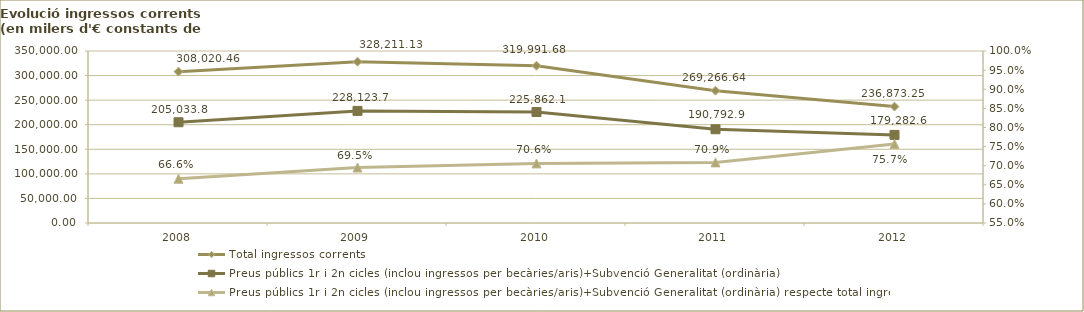
| Category | Total ingressos corrents  | Preus públics 1r i 2n cicles (inclou ingressos per becàries/aris)+Subvenció Generalitat (ordinària) |
|---|---|---|
| 2008.0 | 308020.464 | 205033.761 |
| 2009.0 | 328211.13 | 228123.738 |
| 2010.0 | 319991.684 | 225862.109 |
| 2011.0 | 269266.636 | 190792.917 |
| 2012.0 | 236873.251 | 179282.596 |